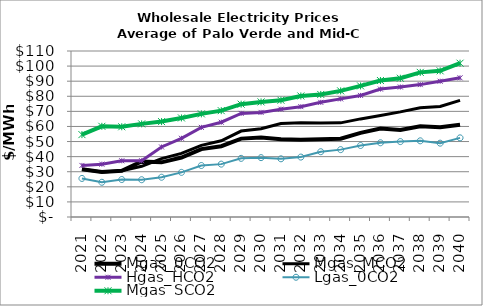
| Category | Mgas_0CO2 | Mgas_MCO2 | Hgas_HCO2 | Lgas_0CO2 | Mgas_SCO2 |
|---|---|---|---|---|---|
| 2021.0 | 31.67 | 31.67 | 34.174 | 25.558 | 54.596 |
| 2022.0 | 29.793 | 29.793 | 35.01 | 23.008 | 60.1 |
| 2023.0 | 30.589 | 30.589 | 37.239 | 24.832 | 59.794 |
| 2024.0 | 36.778 | 33.584 | 37.269 | 24.698 | 61.705 |
| 2025.0 | 36.233 | 38.715 | 46.405 | 26.343 | 63.226 |
| 2026.0 | 39.401 | 42.143 | 52.165 | 29.574 | 65.65 |
| 2027.0 | 44.995 | 47.472 | 59.397 | 34.118 | 68.34 |
| 2028.0 | 46.915 | 50.511 | 62.807 | 35.039 | 70.466 |
| 2029.0 | 51.943 | 56.963 | 68.665 | 38.865 | 74.765 |
| 2030.0 | 52.597 | 58.505 | 69.323 | 39.336 | 76.259 |
| 2031.0 | 51.547 | 61.997 | 71.452 | 38.558 | 77.395 |
| 2032.0 | 51.169 | 62.408 | 73.114 | 39.713 | 80.211 |
| 2033.0 | 51.535 | 62.299 | 75.977 | 43.252 | 81.216 |
| 2034.0 | 51.889 | 62.384 | 78.264 | 44.64 | 83.577 |
| 2035.0 | 55.745 | 65.008 | 80.565 | 47.384 | 86.86 |
| 2036.0 | 58.608 | 67.272 | 84.761 | 49.189 | 90.441 |
| 2037.0 | 57.659 | 69.669 | 86.136 | 49.972 | 91.948 |
| 2038.0 | 60.076 | 72.371 | 87.731 | 50.483 | 95.845 |
| 2039.0 | 59.457 | 73.204 | 89.973 | 48.933 | 96.86 |
| 2040.0 | 61.082 | 77.326 | 92.23 | 52.448 | 101.915 |